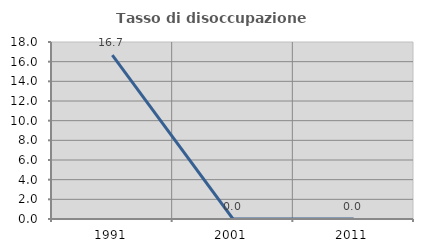
| Category | Tasso di disoccupazione giovanile  |
|---|---|
| 1991.0 | 16.667 |
| 2001.0 | 0 |
| 2011.0 | 0 |